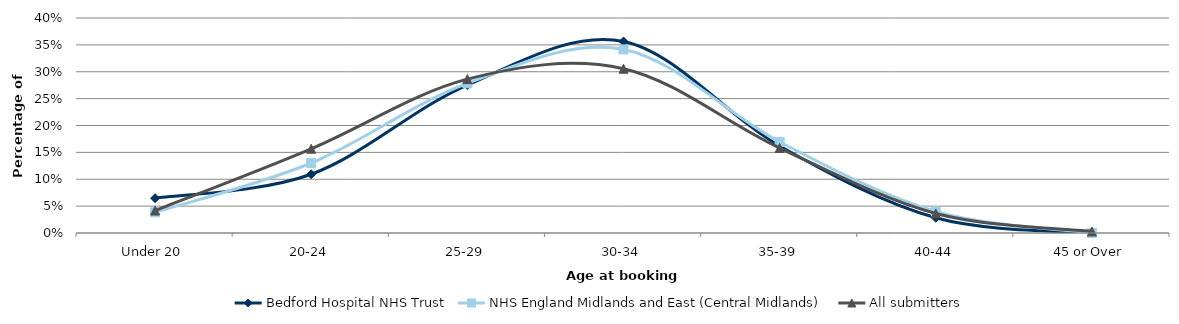
| Category | Bedford Hospital NHS Trust | NHS England Midlands and East (Central Midlands) | All submitters |
|---|---|---|---|
| Under 20 | 0.065 | 0.038 | 0.042 |
| 20-24 | 0.109 | 0.13 | 0.157 |
| 25-29 | 0.275 | 0.278 | 0.286 |
| 30-34 | 0.356 | 0.342 | 0.306 |
| 35-39 | 0.162 | 0.17 | 0.158 |
| 40-44 | 0.028 | 0.04 | 0.036 |
| 45 or Over | 0 | 0 | 0.003 |